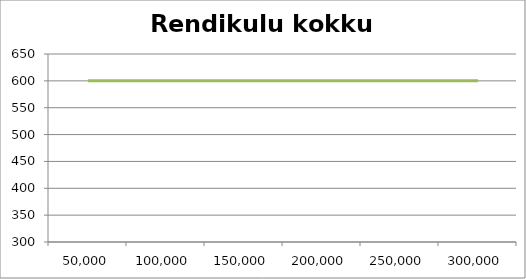
| Category | Rendikulu kokku (eur) |
|---|---|
| 50000.0 | 600 |
| 100000.0 | 600 |
| 150000.0 | 600 |
| 200000.0 | 600 |
| 250000.0 | 600 |
| 300000.0 | 600 |